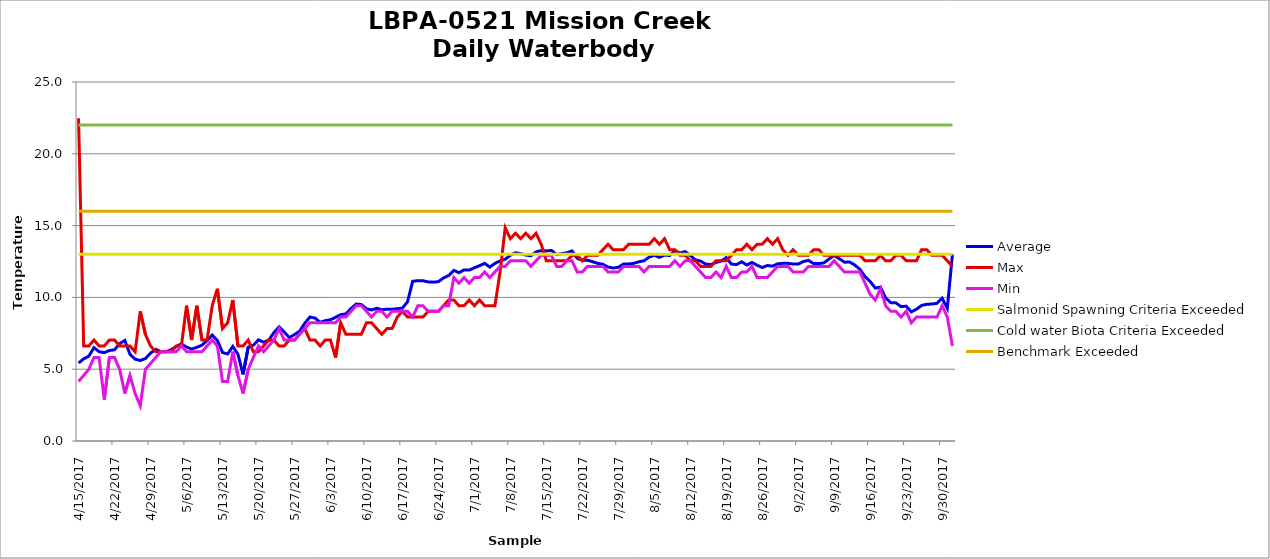
| Category | Average | Max | Min | Salmonid Spawning Criteria Exceeded | Cold water Biota Criteria Exceeded | Benchmark Exceeded |
|---|---|---|---|---|---|---|
| 4/15/17 | 5.43 | 22.48 | 4.15 | 13 | 22 | 16 |
| 4/16/17 | 5.721 | 6.62 | 4.57 | 13 | 22 | 16 |
| 4/17/17 | 5.911 | 6.62 | 4.99 | 13 | 22 | 16 |
| 4/18/17 | 6.5 | 7.03 | 5.81 | 13 | 22 | 16 |
| 4/19/17 | 6.217 | 6.62 | 5.81 | 13 | 22 | 16 |
| 4/20/17 | 6.156 | 6.62 | 2.89 | 13 | 22 | 16 |
| 4/21/17 | 6.302 | 7.03 | 5.81 | 13 | 22 | 16 |
| 4/22/17 | 6.353 | 7.03 | 5.81 | 13 | 22 | 16 |
| 4/23/17 | 6.783 | 6.62 | 4.99 | 13 | 22 | 16 |
| 4/24/17 | 7.002 | 6.62 | 3.31 | 13 | 22 | 16 |
| 4/25/17 | 6.041 | 6.62 | 4.57 | 13 | 22 | 16 |
| 4/26/17 | 5.699 | 6.22 | 3.31 | 13 | 22 | 16 |
| 4/27/17 | 5.606 | 9.03 | 2.46 | 13 | 22 | 16 |
| 4/28/17 | 5.741 | 7.43 | 4.99 | 13 | 22 | 16 |
| 4/29/17 | 6.115 | 6.62 | 5.4 | 13 | 22 | 16 |
| 4/30/17 | 6.387 | 6.22 | 5.81 | 13 | 22 | 16 |
| 5/1/17 | 6.22 | 6.22 | 6.22 | 13 | 22 | 16 |
| 5/2/17 | 6.22 | 6.22 | 6.22 | 13 | 22 | 16 |
| 5/3/17 | 6.353 | 6.22 | 6.22 | 13 | 22 | 16 |
| 5/4/17 | 6.59 | 6.62 | 6.22 | 13 | 22 | 16 |
| 5/5/17 | 6.757 | 6.62 | 6.62 | 13 | 22 | 16 |
| 5/6/17 | 6.537 | 9.42 | 6.22 | 13 | 22 | 16 |
| 5/7/17 | 6.403 | 7.03 | 6.22 | 13 | 22 | 16 |
| 5/8/17 | 6.522 | 9.42 | 6.22 | 13 | 22 | 16 |
| 5/9/17 | 6.674 | 7.03 | 6.22 | 13 | 22 | 16 |
| 5/10/17 | 6.993 | 7.03 | 6.62 | 13 | 22 | 16 |
| 5/11/17 | 7.38 | 9.42 | 7.03 | 13 | 22 | 16 |
| 5/12/17 | 6.996 | 10.6 | 6.62 | 13 | 22 | 16 |
| 5/13/17 | 6.16 | 7.83 | 4.15 | 13 | 22 | 16 |
| 5/14/17 | 6.061 | 8.23 | 4.15 | 13 | 22 | 16 |
| 5/15/17 | 6.59 | 9.82 | 6.22 | 13 | 22 | 16 |
| 5/16/17 | 6.044 | 6.62 | 4.57 | 13 | 22 | 16 |
| 5/17/17 | 4.638 | 6.62 | 3.31 | 13 | 22 | 16 |
| 5/18/17 | 6.533 | 7.03 | 4.99 | 13 | 22 | 16 |
| 5/19/17 | 6.673 | 6.22 | 5.81 | 13 | 22 | 16 |
| 5/20/17 | 7.043 | 6.22 | 6.62 | 13 | 22 | 16 |
| 5/21/17 | 6.875 | 6.62 | 6.22 | 13 | 22 | 16 |
| 5/22/17 | 7.026 | 7.03 | 6.62 | 13 | 22 | 16 |
| 5/23/17 | 7.547 | 7.03 | 7.03 | 13 | 22 | 16 |
| 5/24/17 | 7.947 | 6.62 | 7.83 | 13 | 22 | 16 |
| 5/25/17 | 7.597 | 6.62 | 7.03 | 13 | 22 | 16 |
| 5/26/17 | 7.197 | 7.03 | 7.03 | 13 | 22 | 16 |
| 5/27/17 | 7.413 | 7.03 | 7.03 | 13 | 22 | 16 |
| 5/28/17 | 7.647 | 7.43 | 7.43 | 13 | 22 | 16 |
| 5/29/17 | 8.197 | 7.83 | 7.83 | 13 | 22 | 16 |
| 5/30/17 | 8.63 | 7.03 | 8.23 | 13 | 22 | 16 |
| 5/31/17 | 8.563 | 7.03 | 8.23 | 13 | 22 | 16 |
| 6/1/17 | 8.263 | 6.62 | 8.23 | 13 | 22 | 16 |
| 6/2/17 | 8.38 | 7.03 | 8.23 | 13 | 22 | 16 |
| 6/3/17 | 8.447 | 7.03 | 8.23 | 13 | 22 | 16 |
| 6/4/17 | 8.613 | 5.81 | 8.23 | 13 | 22 | 16 |
| 6/5/17 | 8.797 | 8.23 | 8.63 | 13 | 22 | 16 |
| 6/6/17 | 8.847 | 7.43 | 8.63 | 13 | 22 | 16 |
| 6/7/17 | 9.225 | 7.43 | 9.03 | 13 | 22 | 16 |
| 6/8/17 | 9.537 | 7.43 | 9.42 | 13 | 22 | 16 |
| 6/9/17 | 9.503 | 7.43 | 9.42 | 13 | 22 | 16 |
| 6/10/17 | 9.209 | 8.23 | 9.03 | 13 | 22 | 16 |
| 6/11/17 | 9.127 | 8.23 | 8.63 | 13 | 22 | 16 |
| 6/12/17 | 9.242 | 7.83 | 9.03 | 13 | 22 | 16 |
| 6/13/17 | 9.144 | 7.43 | 9.03 | 13 | 22 | 16 |
| 6/14/17 | 9.175 | 7.83 | 8.63 | 13 | 22 | 16 |
| 6/15/17 | 9.176 | 7.83 | 9.03 | 13 | 22 | 16 |
| 6/16/17 | 9.209 | 8.63 | 9.03 | 13 | 22 | 16 |
| 6/17/17 | 9.257 | 9.03 | 9.03 | 13 | 22 | 16 |
| 6/18/17 | 9.699 | 8.63 | 9.03 | 13 | 22 | 16 |
| 6/19/17 | 11.125 | 8.63 | 8.63 | 13 | 22 | 16 |
| 6/20/17 | 11.162 | 8.63 | 9.42 | 13 | 22 | 16 |
| 6/21/17 | 11.16 | 8.63 | 9.42 | 13 | 22 | 16 |
| 6/22/17 | 11.079 | 9.03 | 9.03 | 13 | 22 | 16 |
| 6/23/17 | 11.062 | 9.03 | 9.03 | 13 | 22 | 16 |
| 6/24/17 | 11.096 | 9.03 | 9.03 | 13 | 22 | 16 |
| 6/25/17 | 11.355 | 9.42 | 9.42 | 13 | 22 | 16 |
| 6/26/17 | 11.522 | 9.82 | 9.42 | 13 | 22 | 16 |
| 6/27/17 | 11.884 | 9.82 | 11.38 | 13 | 22 | 16 |
| 6/28/17 | 11.721 | 9.42 | 10.99 | 13 | 22 | 16 |
| 6/29/17 | 11.916 | 9.42 | 11.38 | 13 | 22 | 16 |
| 6/30/17 | 11.9 | 9.82 | 10.99 | 13 | 22 | 16 |
| 7/1/17 | 12.063 | 9.42 | 11.38 | 13 | 22 | 16 |
| 7/2/17 | 12.208 | 9.82 | 11.38 | 13 | 22 | 16 |
| 7/3/17 | 12.368 | 9.42 | 11.77 | 13 | 22 | 16 |
| 7/4/17 | 12.111 | 9.42 | 11.38 | 13 | 22 | 16 |
| 7/5/17 | 12.368 | 9.42 | 11.77 | 13 | 22 | 16 |
| 7/6/17 | 12.546 | 11.77 | 12.16 | 13 | 22 | 16 |
| 7/7/17 | 12.659 | 14.85 | 12.16 | 13 | 22 | 16 |
| 7/8/17 | 12.934 | 14.09 | 12.55 | 13 | 22 | 16 |
| 7/9/17 | 13.109 | 14.47 | 12.55 | 13 | 22 | 16 |
| 7/10/17 | 13.046 | 14.09 | 12.55 | 13 | 22 | 16 |
| 7/11/17 | 12.95 | 14.47 | 12.55 | 13 | 22 | 16 |
| 7/12/17 | 12.901 | 14.09 | 12.16 | 13 | 22 | 16 |
| 7/13/17 | 13.172 | 14.47 | 12.55 | 13 | 22 | 16 |
| 7/14/17 | 13.253 | 13.7 | 12.93 | 13 | 22 | 16 |
| 7/15/17 | 13.237 | 12.55 | 12.93 | 13 | 22 | 16 |
| 7/16/17 | 13.268 | 12.55 | 12.93 | 13 | 22 | 16 |
| 7/17/17 | 12.98 | 12.55 | 12.16 | 13 | 22 | 16 |
| 7/18/17 | 13.044 | 12.55 | 12.16 | 13 | 22 | 16 |
| 7/19/17 | 13.109 | 12.55 | 12.55 | 13 | 22 | 16 |
| 7/20/17 | 13.238 | 12.93 | 12.55 | 13 | 22 | 16 |
| 7/21/17 | 12.723 | 12.93 | 11.77 | 13 | 22 | 16 |
| 7/22/17 | 12.578 | 12.55 | 11.77 | 13 | 22 | 16 |
| 7/23/17 | 12.595 | 12.93 | 12.16 | 13 | 22 | 16 |
| 7/24/17 | 12.484 | 12.93 | 12.16 | 13 | 22 | 16 |
| 7/25/17 | 12.371 | 12.93 | 12.16 | 13 | 22 | 16 |
| 7/26/17 | 12.306 | 13.32 | 12.16 | 13 | 22 | 16 |
| 7/27/17 | 12.111 | 13.7 | 11.77 | 13 | 22 | 16 |
| 7/28/17 | 12.046 | 13.32 | 11.77 | 13 | 22 | 16 |
| 7/29/17 | 12.095 | 13.32 | 11.77 | 13 | 22 | 16 |
| 7/30/17 | 12.323 | 13.32 | 12.16 | 13 | 22 | 16 |
| 7/31/17 | 12.323 | 13.7 | 12.16 | 13 | 22 | 16 |
| 8/1/17 | 12.371 | 13.7 | 12.16 | 13 | 22 | 16 |
| 8/2/17 | 12.483 | 13.7 | 12.16 | 13 | 22 | 16 |
| 8/3/17 | 12.546 | 13.7 | 11.77 | 13 | 22 | 16 |
| 8/4/17 | 12.805 | 13.7 | 12.16 | 13 | 22 | 16 |
| 8/5/17 | 12.932 | 14.09 | 12.16 | 13 | 22 | 16 |
| 8/6/17 | 12.788 | 13.7 | 12.16 | 13 | 22 | 16 |
| 8/7/17 | 12.948 | 14.09 | 12.16 | 13 | 22 | 16 |
| 8/8/17 | 12.916 | 13.32 | 12.16 | 13 | 22 | 16 |
| 8/9/17 | 13.254 | 13.32 | 12.55 | 13 | 22 | 16 |
| 8/10/17 | 13.092 | 12.93 | 12.16 | 13 | 22 | 16 |
| 8/11/17 | 13.189 | 12.93 | 12.55 | 13 | 22 | 16 |
| 8/12/17 | 12.916 | 12.55 | 12.55 | 13 | 22 | 16 |
| 8/13/17 | 12.611 | 12.55 | 12.16 | 13 | 22 | 16 |
| 8/14/17 | 12.53 | 12.16 | 11.77 | 13 | 22 | 16 |
| 8/15/17 | 12.319 | 12.16 | 11.38 | 13 | 22 | 16 |
| 8/16/17 | 12.287 | 12.16 | 11.38 | 13 | 22 | 16 |
| 8/17/17 | 12.433 | 12.55 | 11.77 | 13 | 22 | 16 |
| 8/18/17 | 12.529 | 12.55 | 11.38 | 13 | 22 | 16 |
| 8/19/17 | 12.772 | 12.55 | 12.16 | 13 | 22 | 16 |
| 8/20/17 | 12.32 | 12.93 | 11.38 | 13 | 22 | 16 |
| 8/21/17 | 12.286 | 13.32 | 11.38 | 13 | 22 | 16 |
| 8/22/17 | 12.481 | 13.32 | 11.77 | 13 | 22 | 16 |
| 8/23/17 | 12.257 | 13.7 | 11.77 | 13 | 22 | 16 |
| 8/24/17 | 12.435 | 13.32 | 12.16 | 13 | 22 | 16 |
| 8/25/17 | 12.239 | 13.7 | 11.38 | 13 | 22 | 16 |
| 8/26/17 | 12.078 | 13.7 | 11.38 | 13 | 22 | 16 |
| 8/27/17 | 12.223 | 14.09 | 11.38 | 13 | 22 | 16 |
| 8/28/17 | 12.176 | 13.7 | 11.77 | 13 | 22 | 16 |
| 8/29/17 | 12.339 | 14.09 | 12.16 | 13 | 22 | 16 |
| 8/30/17 | 12.371 | 13.32 | 12.16 | 13 | 22 | 16 |
| 8/31/17 | 12.371 | 12.93 | 12.16 | 13 | 22 | 16 |
| 9/1/17 | 12.323 | 13.32 | 11.77 | 13 | 22 | 16 |
| 9/2/17 | 12.323 | 12.93 | 11.77 | 13 | 22 | 16 |
| 9/3/17 | 12.497 | 12.93 | 11.77 | 13 | 22 | 16 |
| 9/4/17 | 12.579 | 12.93 | 12.16 | 13 | 22 | 16 |
| 9/5/17 | 12.355 | 13.32 | 12.16 | 13 | 22 | 16 |
| 9/6/17 | 12.355 | 13.32 | 12.16 | 13 | 22 | 16 |
| 9/7/17 | 12.404 | 12.93 | 12.16 | 13 | 22 | 16 |
| 9/8/17 | 12.676 | 12.93 | 12.16 | 13 | 22 | 16 |
| 9/9/17 | 12.917 | 12.93 | 12.55 | 13 | 22 | 16 |
| 9/10/17 | 12.691 | 12.93 | 12.16 | 13 | 22 | 16 |
| 9/11/17 | 12.45 | 12.93 | 11.77 | 13 | 22 | 16 |
| 9/12/17 | 12.466 | 12.93 | 11.77 | 13 | 22 | 16 |
| 9/13/17 | 12.258 | 12.93 | 11.77 | 13 | 22 | 16 |
| 9/14/17 | 11.949 | 12.93 | 11.77 | 13 | 22 | 16 |
| 9/15/17 | 11.445 | 12.55 | 10.99 | 13 | 22 | 16 |
| 9/16/17 | 11.104 | 12.55 | 10.21 | 13 | 22 | 16 |
| 9/17/17 | 10.649 | 12.55 | 9.82 | 13 | 22 | 16 |
| 9/18/17 | 10.714 | 12.93 | 10.6 | 13 | 22 | 16 |
| 9/19/17 | 9.965 | 12.55 | 9.42 | 13 | 22 | 16 |
| 9/20/17 | 9.637 | 12.55 | 9.03 | 13 | 22 | 16 |
| 9/21/17 | 9.62 | 12.93 | 9.03 | 13 | 22 | 16 |
| 9/22/17 | 9.357 | 12.93 | 8.63 | 13 | 22 | 16 |
| 9/23/17 | 9.39 | 12.55 | 9.03 | 13 | 22 | 16 |
| 9/24/17 | 8.992 | 12.55 | 8.23 | 13 | 22 | 16 |
| 9/25/17 | 9.175 | 12.55 | 8.63 | 13 | 22 | 16 |
| 9/26/17 | 9.44 | 13.32 | 8.63 | 13 | 22 | 16 |
| 9/27/17 | 9.521 | 13.32 | 8.63 | 13 | 22 | 16 |
| 9/28/17 | 9.538 | 12.93 | 8.63 | 13 | 22 | 16 |
| 9/29/17 | 9.587 | 12.93 | 8.63 | 13 | 22 | 16 |
| 9/30/17 | 9.95 | 12.93 | 9.42 | 13 | 22 | 16 |
| 10/1/17 | 9.242 | 12.55 | 8.63 | 13 | 22 | 16 |
| 10/2/17 | 12.998 | 12.16 | 6.62 | 13 | 22 | 16 |